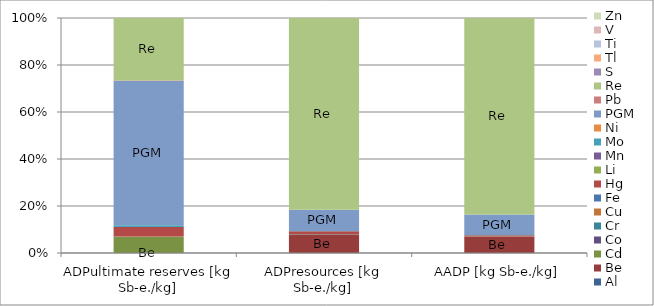
| Category | Al | Be | Cd | Co | Cr | Cu | Fe | Hg | Li | Mn | Mo | Ni | PGM | Pb | Re | S | Tl | Ti | V | Zn |
|---|---|---|---|---|---|---|---|---|---|---|---|---|---|---|---|---|---|---|---|---|
| ADPultimate reserves [kg Sb-e./kg] | 0 | 0 | 0.157 | 0 | 0 | 0.001 | 0 | 0.092 | 0 | 0 | 0.018 | 0 | 1.396 | 0.006 | 0.603 | 0 | 0 | 0 | 0 | 0.001 |
| ADPresources [kg Sb-e./kg] | 0 | 5.706 | 0.087 | 0.068 | 0 | 0 | 0 | 0.784 | 0.003 | 0.001 | 0.093 | 0.016 | 6.559 | 0 | 58.849 | 0 | 0.003 | 0 | 0.002 | 0 |
| AADP [kg Sb-e./kg] | 0 | 17.216 | 0.272 | 0.227 | 0 | 0.001 | 0 | 1.337 | 0.009 | 0.003 | 0.246 | 0.038 | 21.841 | 0.001 | 209.79 | 0.001 | 0.014 | 0.001 | 0.009 | 0.001 |